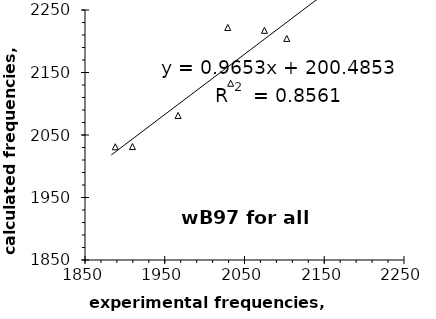
| Category | Series 0 |
|---|---|
| 2032.666666666667 | 2132.75 |
| 1966.75 | 2081.25 |
| 1888.0 | 2031.191 |
| 1909.5 | 2031.5 |
| 2103.0 | 2204.5 |
| 2029.0 | 2222.032 |
| 2075.0 | 2217.5 |